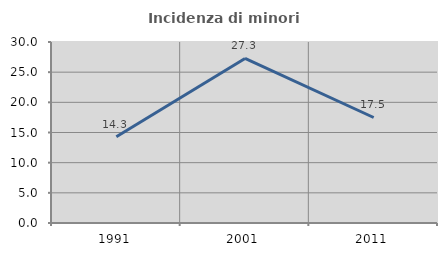
| Category | Incidenza di minori stranieri |
|---|---|
| 1991.0 | 14.286 |
| 2001.0 | 27.273 |
| 2011.0 | 17.486 |